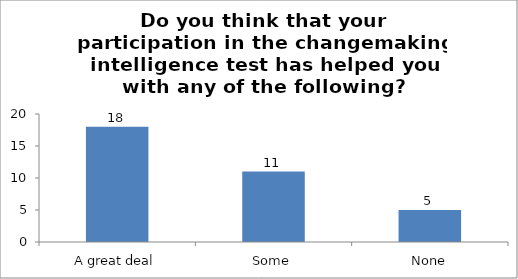
| Category | Do you think that your participation in the changemaking intelligence test has helped you with any of the following?
 xvi. Improving communication skills. |
|---|---|
| A great deal | 18 |
| Some | 11 |
| None | 5 |